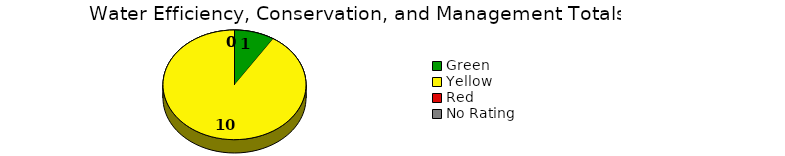
| Category | Series 0 |
|---|---|
| Green | 1 |
| Yellow | 10 |
| Red | 0 |
| No Rating | 0 |